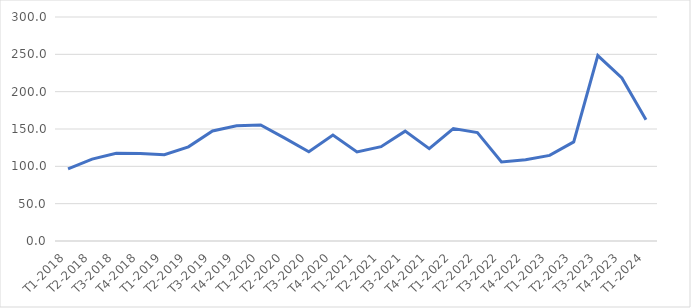
| Category | Series 0 |
|---|---|
| T1-2018 | 96.488 |
| T2-2018 | 109.676 |
| T3-2018 | 117.479 |
| T4-2018 | 117.282 |
| T1-2019 | 115.591 |
| T2-2019 | 126.116 |
| T3-2019 | 147.383 |
| T4-2019 | 154.226 |
| T1-2020 | 155.341 |
| T2-2020 | 137.865 |
| T3-2020 | 119.524 |
| T4-2020 | 141.88 |
| T1-2021 | 119.302 |
| T2-2021 | 126.362 |
| T3-2021 | 147.148 |
| T4-2021 | 123.59 |
| T1-2022 | 150.546 |
| T2-2022 | 145.219 |
| T3-2022 | 105.971 |
| T4-2022 | 108.907 |
| T1-2023 | 114.645 |
| T2-2023 | 132.74 |
| T3-2023 | 248.316 |
| T4-2023 | 218.445 |
| T1-2024 | 162.277 |